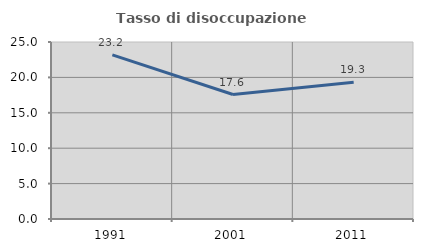
| Category | Tasso di disoccupazione giovanile  |
|---|---|
| 1991.0 | 23.173 |
| 2001.0 | 17.578 |
| 2011.0 | 19.324 |